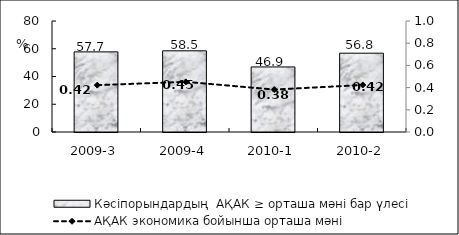
| Category | Кәсіпорындардың  АҚАК ≥ орташа мәні бар үлесі  |
|---|---|
| 2009-3 | 57.74 |
| 2009-4 | 58.51 |
| 2010-1 | 46.89 |
| 2010-2 | 56.8 |